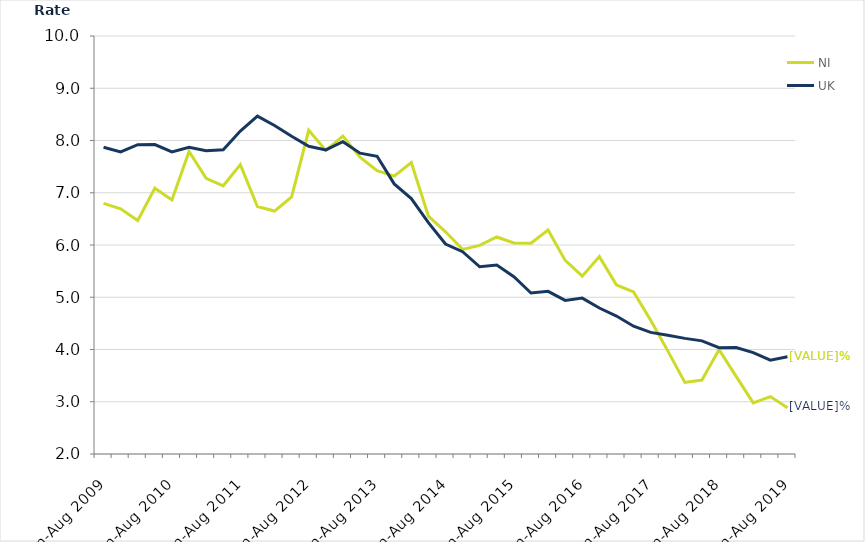
| Category | NI | UK |
|---|---|---|
| Jun-Aug 2009 | 6.796 | 7.87 |
| Sep-Nov 2009 | 6.693 | 7.781 |
| Dec-Feb 2010 | 6.47 | 7.92 |
| Mar-May 2010 | 7.085 | 7.923 |
| Jun-Aug 2010 | 6.862 | 7.782 |
| Sep-Nov 2010 | 7.791 | 7.871 |
| Dec-Feb 2011 | 7.277 | 7.803 |
| Mar-May 2011 | 7.133 | 7.822 |
| Jun-Aug 2011 | 7.538 | 8.181 |
| Sep-Nov 2011 | 6.736 | 8.467 |
| Dec-Feb 2012 | 6.65 | 8.289 |
| Mar-May 2012 | 6.922 | 8.08 |
| Jun-Aug 2012 | 8.196 | 7.89 |
| Sep-Nov 2012 | 7.81 | 7.82 |
| Dec-Feb 2013 | 8.083 | 7.976 |
| Mar-May 2013 | 7.68 | 7.758 |
| Jun-Aug 2013 | 7.422 | 7.698 |
| Sep-Nov 2013 | 7.318 | 7.17 |
| Dec-Feb 2014 | 7.578 | 6.889 |
| Mar-May 2014 | 6.554 | 6.428 |
| Jun-Aug 2014 | 6.253 | 6.019 |
| Sep-Nov 2014 | 5.916 | 5.871 |
| Dec-Feb 2015 | 5.991 | 5.583 |
| Mar-May 2015 | 6.154 | 5.617 |
| Jun-Aug 2015 | 6.039 | 5.392 |
| Sep-Nov 2015 | 6.033 | 5.081 |
| Dec-Feb 2016 | 6.288 | 5.113 |
| Mar-May 2016 | 5.706 | 4.939 |
| Jun-Aug 2016 | 5.404 | 4.983 |
| Sep-Nov 2016 | 5.778 | 4.794 |
| Dec-Feb 2017 | 5.235 | 4.64 |
| Mar-May 2017 | 5.102 | 4.445 |
| Jun-Aug 2017 | 4.558 | 4.328 |
| Sep-Nov 2017 | 3.974 | 4.272 |
| Dec-Feb 2018 | 3.371 | 4.213 |
| Mar-May 2018 | 3.416 | 4.165 |
| Jun-Aug 2018 | 3.999 | 4.035 |
| Sep-Nov 2018 | 3.486 | 4.039 |
| Dec-Feb 2019 | 2.979 | 3.942 |
| Mar-May 2019 | 3.099 | 3.796 |
| Jun-Aug 2019 | 2.886 | 3.863 |